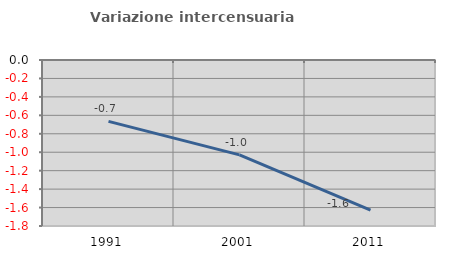
| Category | Variazione intercensuaria annua |
|---|---|
| 1991.0 | -0.665 |
| 2001.0 | -1.029 |
| 2011.0 | -1.628 |